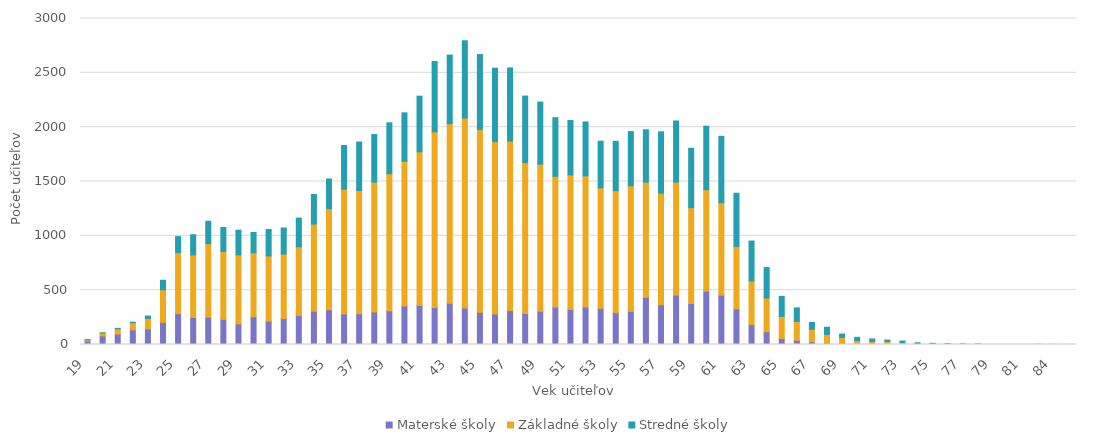
| Category | Materské školy | Základné školy | Stredné školy |
|---|---|---|---|
| 19.0 | 31 | 12 | 1 |
| 20.0 | 79 | 26 | 2 |
| 21.0 | 96 | 49 | 4 |
| 22.0 | 135 | 66 | 4 |
| 23.0 | 144 | 96 | 22 |
| 24.0 | 204 | 299 | 88 |
| 25.0 | 284 | 562 | 147 |
| 26.0 | 249 | 576 | 185 |
| 27.0 | 251 | 677 | 206 |
| 28.0 | 231 | 626 | 220 |
| 29.0 | 190 | 635 | 227 |
| 30.0 | 255 | 589 | 187 |
| 31.0 | 215 | 600 | 243 |
| 32.0 | 237 | 595 | 240 |
| 33.0 | 268 | 631 | 264 |
| 34.0 | 307 | 801 | 272 |
| 35.0 | 320 | 930 | 273 |
| 36.0 | 282 | 1147 | 402 |
| 37.0 | 283 | 1134 | 446 |
| 38.0 | 299 | 1195 | 438 |
| 39.0 | 311 | 1261 | 468 |
| 40.0 | 355 | 1331 | 446 |
| 41.0 | 360 | 1413 | 512 |
| 42.0 | 340 | 1617 | 647 |
| 43.0 | 379 | 1654 | 630 |
| 44.0 | 337 | 1747 | 711 |
| 45.0 | 297 | 1683 | 688 |
| 46.0 | 281 | 1586 | 676 |
| 47.0 | 313 | 1558 | 674 |
| 48.0 | 285 | 1389 | 612 |
| 49.0 | 305 | 1355 | 571 |
| 50.0 | 346 | 1202 | 539 |
| 51.0 | 322 | 1239 | 500 |
| 52.0 | 346 | 1206 | 496 |
| 53.0 | 332 | 1110 | 429 |
| 54.0 | 292 | 1125 | 453 |
| 55.0 | 305 | 1156 | 498 |
| 56.0 | 434 | 1060 | 482 |
| 57.0 | 366 | 1027 | 564 |
| 58.0 | 455 | 1039 | 563 |
| 59.0 | 377 | 882 | 547 |
| 60.0 | 490 | 935 | 584 |
| 61.0 | 454 | 851 | 611 |
| 62.0 | 327 | 576 | 489 |
| 63.0 | 183 | 403 | 366 |
| 64.0 | 117 | 311 | 280 |
| 65.0 | 56 | 203 | 184 |
| 66.0 | 40 | 172 | 125 |
| 67.0 | 25 | 116 | 62 |
| 68.0 | 14 | 79 | 66 |
| 69.0 | 12 | 54 | 30 |
| 70.0 | 4 | 32 | 30 |
| 71.0 | 4 | 24 | 23 |
| 72.0 | 5 | 23 | 13 |
| 73.0 | 0 | 19 | 13 |
| 74.0 | 2 | 3 | 11 |
| 75.0 | 2 | 6 | 3 |
| 76.0 | 1 | 2 | 5 |
| 77.0 | 0 | 4 | 2 |
| 78.0 | 0 | 2 | 3 |
| 79.0 | 0 | 0 | 1 |
| 80.0 | 0 | 1 | 0 |
| 81.0 | 0 | 0 | 1 |
| 82.0 | 0 | 0 | 2 |
| 84.0 | 0 | 0 | 1 |
| 85.0 | 0 | 1 | 0 |